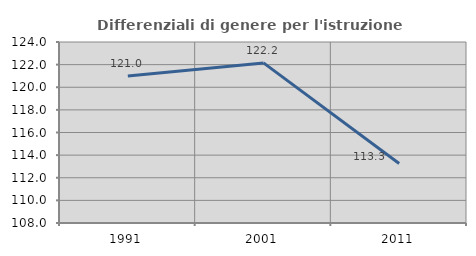
| Category | Differenziali di genere per l'istruzione superiore |
|---|---|
| 1991.0 | 121.004 |
| 2001.0 | 122.152 |
| 2011.0 | 113.264 |